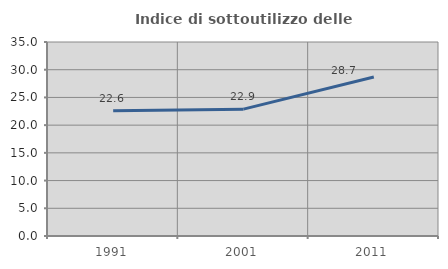
| Category | Indice di sottoutilizzo delle abitazioni  |
|---|---|
| 1991.0 | 22.589 |
| 2001.0 | 22.885 |
| 2011.0 | 28.68 |